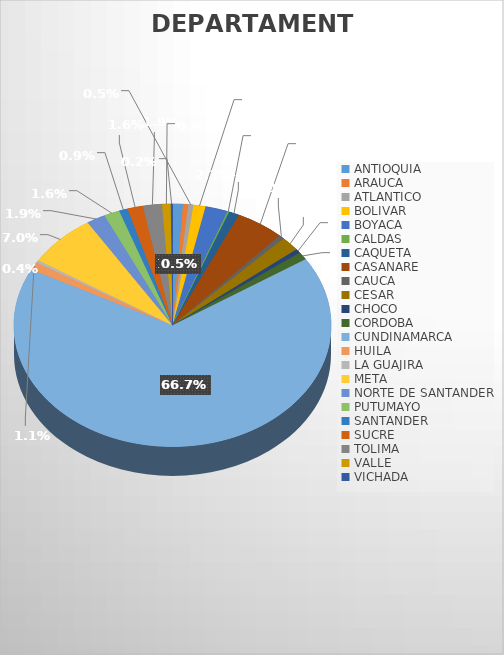
| Category | Series 0 |
|---|---|
| ANTIOQUIA | 6 |
| ARAUCA | 3 |
| ATLANTICO | 3 |
| BOLIVAR | 7 |
| BOYACA | 13 |
| CALDAS | 1 |
| CAQUETA | 6 |
| CASANARE | 28 |
| CAUCA | 3 |
| CESAR | 11 |
| CHOCO | 3 |
| CORDOBA | 6 |
| CUNDINAMARCA | 379 |
| HUILA | 6 |
| LA GUAJIRA | 2 |
| META | 40 |
| NORTE DE SANTANDER | 11 |
| PUTUMAYO | 9 |
| SANTANDER | 5 |
| SUCRE | 9 |
| TOLIMA | 11 |
| VALLE | 5 |
| VICHADA | 1 |